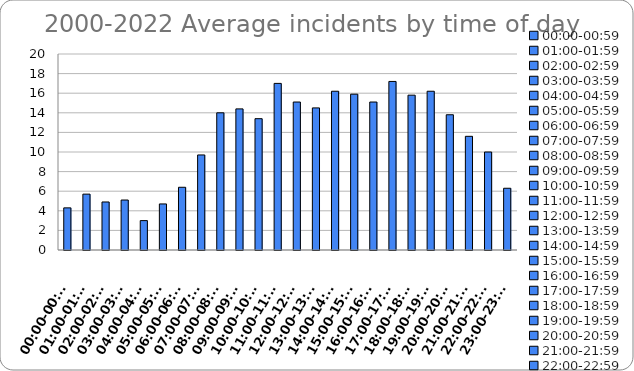
| Category | Series 0 |
|---|---|
| 00:00-00:59 | 4.3 |
| 01:00-01:59 | 5.7 |
| 02:00-02:59 | 4.9 |
| 03:00-03:59 | 5.1 |
| 04:00-04:59 | 3 |
| 05:00-05:59 | 4.7 |
| 06:00-06:59 | 6.4 |
| 07:00-07:59 | 9.7 |
| 08:00-08:59 | 14 |
| 09:00-09:59 | 14.4 |
| 10:00-10:59 | 13.4 |
| 11:00-11:59 | 17 |
| 12:00-12:59 | 15.1 |
| 13:00-13:59 | 14.5 |
| 14:00-14:59 | 16.2 |
| 15:00-15:59 | 15.9 |
| 16:00-16:59 | 15.1 |
| 17:00-17:59 | 17.2 |
| 18:00-18:59 | 15.8 |
| 19:00-19:59 | 16.2 |
| 20:00-20:59 | 13.8 |
| 21:00-21:59 | 11.6 |
| 22:00-22:59 | 10 |
| 23:00-23:59 | 6.3 |